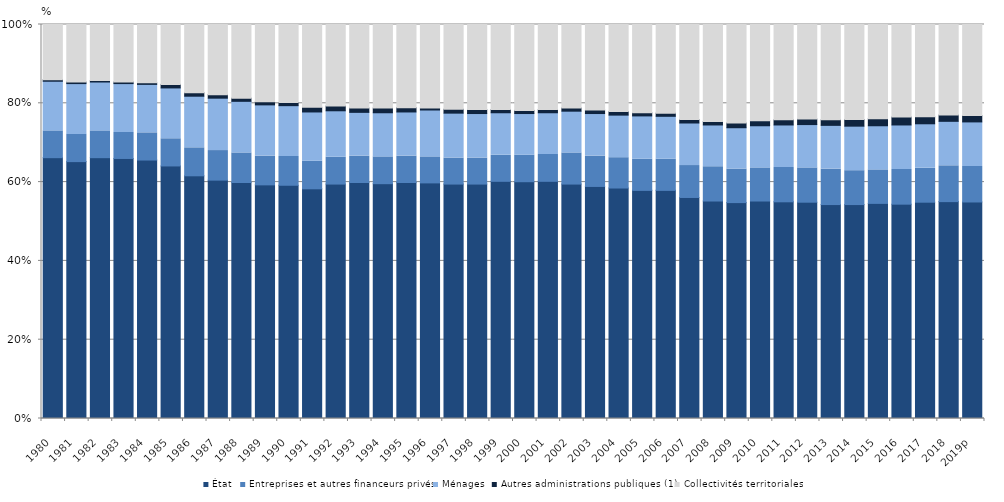
| Category | État | Entreprises et autres financeurs privés | Ménages | Autres administrations publiques (1) | Collectivités territoriales |
|---|---|---|---|---|---|
| 1980 | 66.2 | 6.8 | 12.6 | 0.4 | 14 |
| 1981 | 65.2 | 6.9 | 12.9 | 0.4 | 14.6 |
| 1982 | 66.2 | 6.8 | 12.4 | 0.4 | 14.2 |
| 1983 | 66 | 6.6 | 12.4 | 0.4 | 14.6 |
| 1984 | 65.6 | 6.9 | 12.3 | 0.4 | 14.8 |
| 1985 | 64.1 | 6.9 | 12.9 | 0.9 | 15.2 |
| 1986 | 61.6 | 7.1 | 13.1 | 0.9 | 17.3 |
| 1987 | 60.5 | 7.5 | 13.3 | 0.9 | 17.8 |
| 1988 | 59.9 | 7.5 | 13.1 | 0.8 | 18.7 |
| 1989 | 59.3 | 7.3 | 13 | 0.8 | 19.6 |
| 1990 | 59.2 | 7.3 | 12.9 | 0.8 | 19.8 |
| 1991 | 58.3 | 7 | 12.5 | 1.2 | 21 |
| 1992 | 59.5 | 6.8 | 11.8 | 1.2 | 20.7 |
| 1993 | 59.9 | 6.7 | 11.1 | 1.1 | 21.2 |
| 1994 | 59.6 | 6.8 | 11.2 | 1.2 | 21.2 |
| 1995 | 59.9 | 6.7 | 11.2 | 1.1 | 21.1 |
| 1996 | 59.8 | 6.6 | 11.9 | 0.5 | 21.2 |
| 1997 | 59.5 | 6.6 | 11.4 | 1 | 21.5 |
| 1998 | 59.5 | 6.6 | 11.3 | 1 | 21.6 |
| 1999 | 60.2 | 6.6 | 10.8 | 0.8 | 21.6 |
| 2000 | 60.1 | 6.7 | 10.6 | 0.8 | 21.8 |
| 2001 | 60.2 | 6.8 | 10.6 | 0.8 | 21.6 |
| 2002 | 59.5 | 7.9 | 10.6 | 0.8 | 21.2 |
| 2003 | 58.9 | 7.7 | 10.8 | 0.9 | 21.7 |
| 2004 | 58.5 | 7.7 | 10.8 | 0.9 | 22.1 |
| 2005 | 57.9 | 7.9 | 11 | 0.8 | 22.4 |
| 2006 | 57.9 | 7.9 | 10.9 | 0.8 | 22.5 |
| 2007 | 56.1 | 8.1 | 10.8 | 0.9 | 24.1 |
| 2008 | 55.2 | 8.7 | 10.6 | 0.9 | 24.6 |
| 2009 | 54.8 | 8.5 | 10.5 | 1.2 | 25 |
| 2010 | 55.2 | 8.4 | 10.7 | 1.3 | 24.4 |
| 2011 | 55 | 8.7 | 10.8 | 1.3 | 24.2 |
| 2012 | 54.9 | 8.7 | 11 | 1.4 | 24 |
| 2013 | 54.3 | 9 | 11.1 | 1.4 | 24.2 |
| 2014 | 54.3 | 8.6 | 11.3 | 1.7 | 24.1 |
| 2015 | 54.6 | 8.5 | 11.2 | 1.8 | 23.9 |
| 2016 | 54.4 | 8.8 | 11.3 | 2 | 23.5 |
| 2017 | 54.9 | 8.6 | 11.3 | 1.8 | 23.4 |
| 2018 | 55.1 | 9.1 | 11.3 | 1.6 | 23 |
| 2019p | 54.9 | 9 | 11.3 | 1.6 | 23.1 |